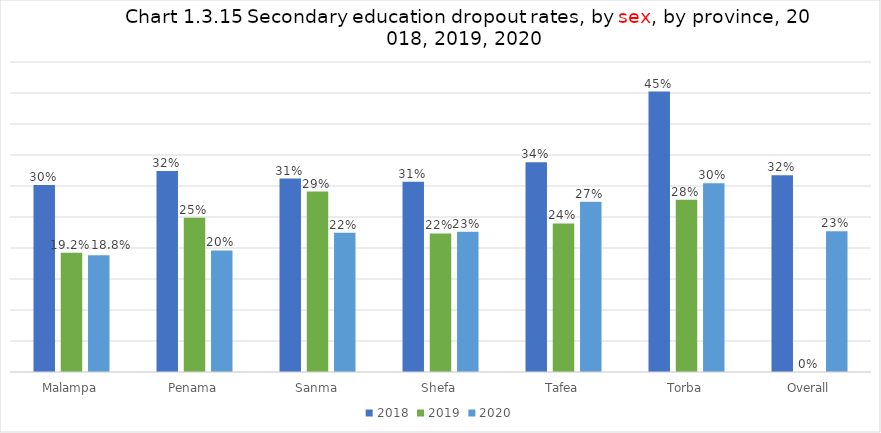
| Category | 2018 | 2019 | 2020 |
|---|---|---|---|
| Malampa | 0.302 | 0.192 | 0.188 |
| Penama | 0.324 | 0.249 | 0.196 |
| Sanma | 0.312 | 0.291 | 0.225 |
| Shefa | 0.307 | 0.224 | 0.226 |
| Tafea | 0.338 | 0.24 | 0.275 |
| Torba | 0.452 | 0.278 | 0.305 |
| Overall | 0.317 | 0 | 0.227 |